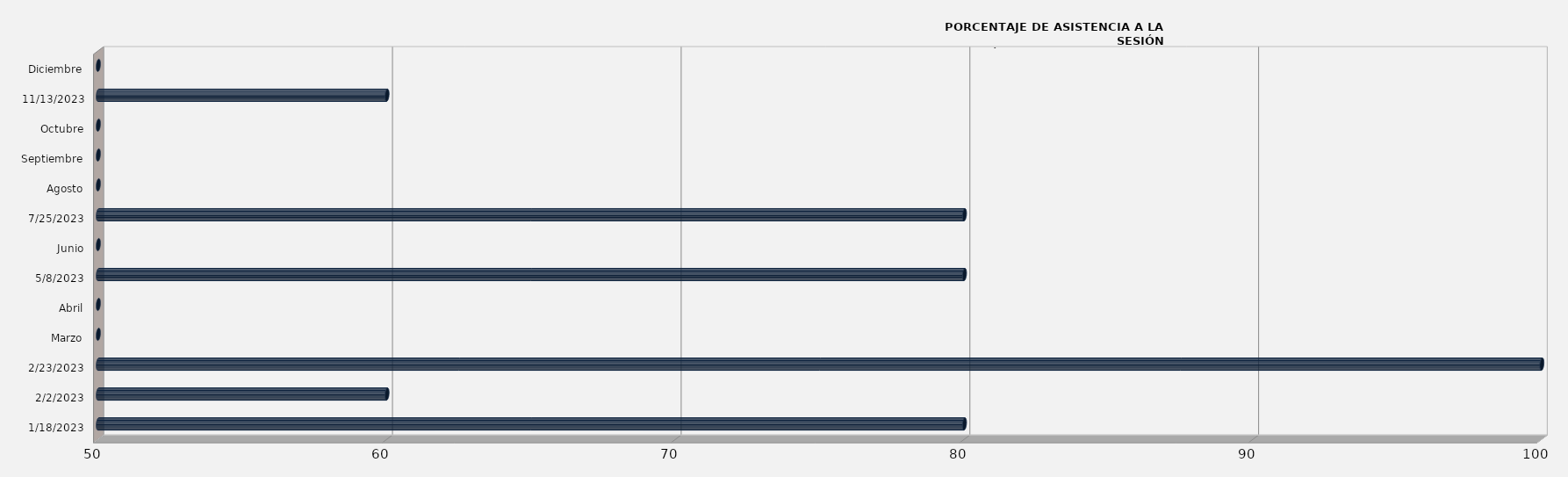
| Category | Series 0 |
|---|---|
| 18/01/2023 | 80 |
| 02/02/2023 | 60 |
| 23/02/2023 | 100 |
| Marzo | 0 |
| Abril | 0 |
| 08/05/2023 | 80 |
| Junio | 0 |
| 25/07/2023 | 80 |
| Agosto | 0 |
| Septiembre | 0 |
| Octubre | 0 |
| 13/11/2023 | 60 |
| Diciembre | 0 |